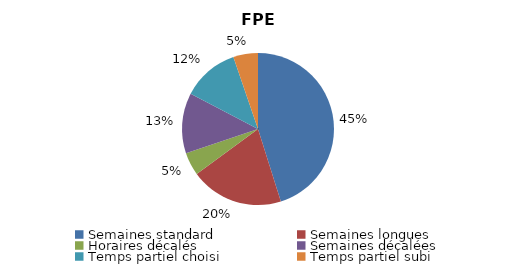
| Category | FPE |
|---|---|
| Semaines standard | 45.14 |
| Semaines longues | 19.788 |
| Horaires décalés | 4.898 |
| Semaines décalées | 12.83 |
| Temps partiel choisi | 12.093 |
| Temps partiel subi | 5.251 |